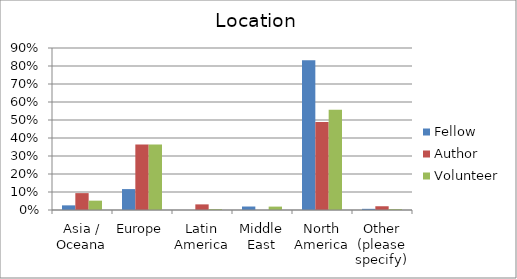
| Category | Fellow | Author | Volunteer |
|---|---|---|---|
| Asia / Oceana | 0.026 | 0.094 | 0.052 |
| Europe | 0.116 | 0.365 | 0.363 |
| Latin America | 0 | 0.031 | 0.005 |
| Middle East | 0.019 | 0 | 0.019 |
| North America | 0.832 | 0.49 | 0.557 |
| Other (please specify) | 0.006 | 0.021 | 0.005 |